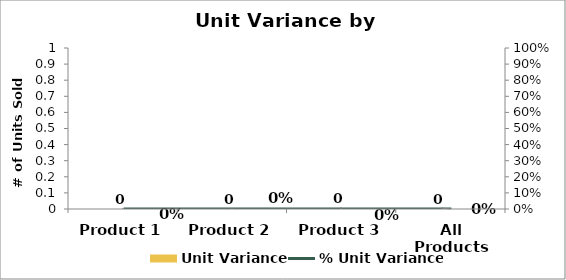
| Category | Unit Variance |
|---|---|
| Product 1 | 0 |
| Product 2 | 0 |
| Product 3 | 0 |
| All Products | 0 |